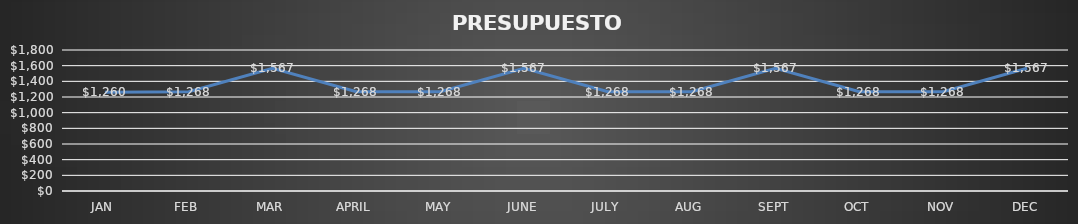
| Category | Series 0 |
|---|---|
| JAN | 1260 |
| FEB | 1268 |
| MAR | 1567 |
| APRIL | 1268 |
| MAY | 1268 |
| JUNE | 1567 |
| JULY | 1268 |
| AUG | 1268 |
| SEPT | 1567 |
| OCT | 1268 |
| NOV | 1268 |
| DEC | 1567 |